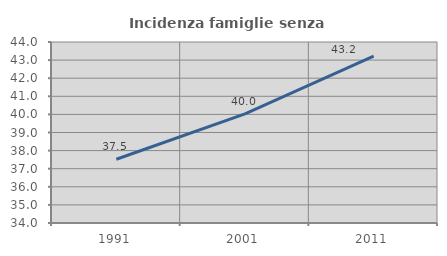
| Category | Incidenza famiglie senza nuclei |
|---|---|
| 1991.0 | 37.522 |
| 2001.0 | 40.033 |
| 2011.0 | 43.223 |